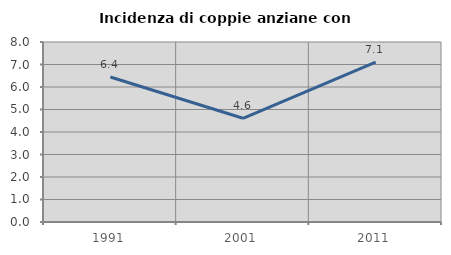
| Category | Incidenza di coppie anziane con figli |
|---|---|
| 1991.0 | 6.443 |
| 2001.0 | 4.609 |
| 2011.0 | 7.105 |